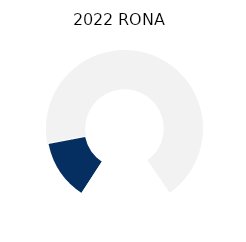
| Category | RONA |
|---|---|
| 0 | 20.547 |
| 1 | 109.453 |
| 2 | 30 |